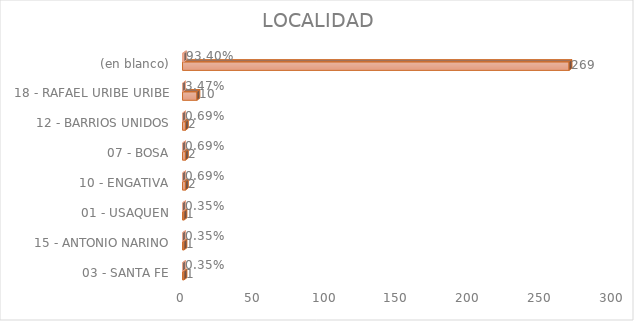
| Category | Cuenta de Número petición | Cuenta de Número petición2 |
|---|---|---|
| 03 - SANTA FE | 1 | 0.003 |
| 15 - ANTONIO NARINO | 1 | 0.003 |
| 01 - USAQUEN | 1 | 0.003 |
| 10 - ENGATIVA | 2 | 0.007 |
| 07 - BOSA | 2 | 0.007 |
| 12 - BARRIOS UNIDOS | 2 | 0.007 |
| 18 - RAFAEL URIBE URIBE | 10 | 0.035 |
| (en blanco) | 269 | 0.934 |